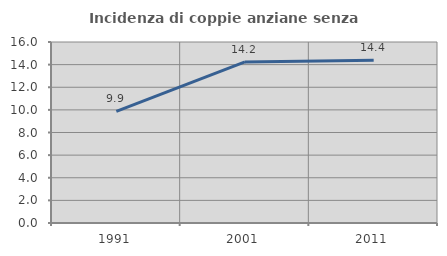
| Category | Incidenza di coppie anziane senza figli  |
|---|---|
| 1991.0 | 9.871 |
| 2001.0 | 14.236 |
| 2011.0 | 14.388 |